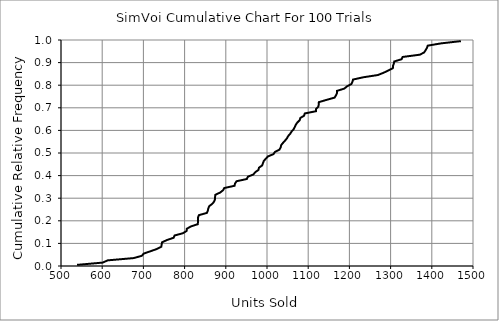
| Category | Series 0 |
|---|---|
| 538.9908018000363 | 0.005 |
| 600.8797298106829 | 0.015 |
| 613.5506962878214 | 0.025 |
| 676.3192585275103 | 0.035 |
| 696.0218862822708 | 0.045 |
| 700.8362677956435 | 0.055 |
| 716.7415929467866 | 0.065 |
| 732.2427400086109 | 0.075 |
| 743.4577781368981 | 0.085 |
| 744.2718811806145 | 0.095 |
| 745.3334934036423 | 0.105 |
| 757.3443138062273 | 0.115 |
| 773.3525200595174 | 0.125 |
| 775.6312556755869 | 0.135 |
| 795.8772844647125 | 0.145 |
| 804.8306583039259 | 0.155 |
| 805.4286285431208 | 0.165 |
| 815.30414517674 | 0.175 |
| 831.9991147940208 | 0.185 |
| 832.46673787131 | 0.195 |
| 832.4779355059433 | 0.205 |
| 832.6524019448946 | 0.215 |
| 834.7279760569274 | 0.225 |
| 854.2304992150957 | 0.235 |
| 856.3551125800636 | 0.245 |
| 857.5931844233969 | 0.255 |
| 859.8738140657605 | 0.265 |
| 867.0982547768922 | 0.275 |
| 871.6810285204074 | 0.285 |
| 873.6827009415773 | 0.295 |
| 873.9411724435046 | 0.305 |
| 874.603444996067 | 0.315 |
| 886.1509308388434 | 0.325 |
| 893.3244129630722 | 0.335 |
| 896.2870831988334 | 0.345 |
| 921.2321974917412 | 0.355 |
| 922.4155705003785 | 0.365 |
| 926.0074625134736 | 0.375 |
| 951.0627538148608 | 0.385 |
| 953.4724346896035 | 0.395 |
| 966.9189485038161 | 0.405 |
| 971.4091549471574 | 0.415 |
| 979.2113113560837 | 0.425 |
| 980.6104859028452 | 0.435 |
| 988.2144326386576 | 0.445 |
| 990.2341857814116 | 0.455 |
| 992.2861438405348 | 0.465 |
| 997.1800475709239 | 0.475 |
| 1002.3863059291955 | 0.485 |
| 1015.6611762761873 | 0.495 |
| 1019.4637411597444 | 0.505 |
| 1030.2035865437097 | 0.515 |
| 1033.2367039437734 | 0.525 |
| 1034.4274075580267 | 0.535 |
| 1038.9570459175025 | 0.545 |
| 1043.8988304091743 | 0.555 |
| 1048.4379801212203 | 0.565 |
| 1051.3923178232073 | 0.575 |
| 1056.208619638397 | 0.585 |
| 1059.6817778812351 | 0.595 |
| 1064.546339232998 | 0.605 |
| 1067.4961717098668 | 0.615 |
| 1069.8917819320027 | 0.625 |
| 1073.694357936928 | 0.635 |
| 1079.3100416607313 | 0.645 |
| 1080.9036500692785 | 0.655 |
| 1090.0064026605994 | 0.665 |
| 1091.6443304564064 | 0.675 |
| 1119.056043201873 | 0.685 |
| 1119.1458730094935 | 0.695 |
| 1124.5207805124694 | 0.705 |
| 1125.6151042472584 | 0.715 |
| 1125.902538398584 | 0.725 |
| 1144.346987670863 | 0.735 |
| 1163.9249930490264 | 0.745 |
| 1167.419868229228 | 0.755 |
| 1169.8612101544886 | 0.765 |
| 1170.0797885633278 | 0.775 |
| 1187.6953989895499 | 0.785 |
| 1194.1909050114357 | 0.795 |
| 1204.8465738497155 | 0.805 |
| 1207.3383528489242 | 0.815 |
| 1208.8526924818707 | 0.825 |
| 1233.5875804751317 | 0.835 |
| 1269.0459592912462 | 0.845 |
| 1282.8143712501453 | 0.855 |
| 1294.5048946550708 | 0.865 |
| 1305.4874969343787 | 0.875 |
| 1305.7105710319795 | 0.885 |
| 1307.7569829173165 | 0.895 |
| 1308.8626778755079 | 0.905 |
| 1326.6852542907861 | 0.915 |
| 1329.3307403705946 | 0.925 |
| 1371.0105038075726 | 0.935 |
| 1381.4380059949115 | 0.945 |
| 1385.0025651443389 | 0.955 |
| 1388.136836670917 | 0.965 |
| 1390.1126832711989 | 0.975 |
| 1422.243596117321 | 0.985 |
| 1470.633751757023 | 0.995 |